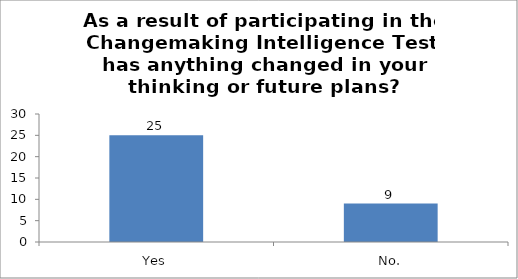
| Category | As a result of participating in the Changemaking Intelligence Test, has anything changed in your thinking or future plans? |
|---|---|
| Yes | 25 |
| No. | 9 |